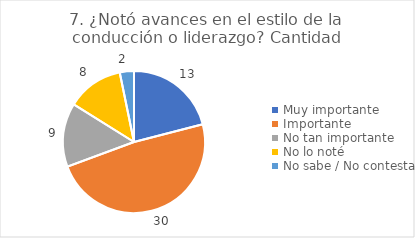
| Category | 7. ¿Notó avances en el estilo de la conducción o liderazgo? |
|---|---|
| Muy importante  | 0.21 |
| Importante  | 0.484 |
| No tan importante  | 0.145 |
| No lo noté  | 0.129 |
| No sabe / No contesta | 0.032 |